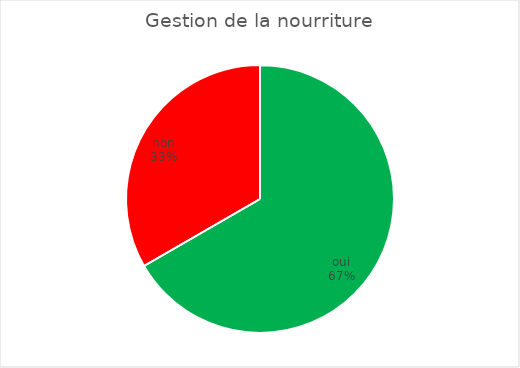
| Category | Gestion de la nourriture |
|---|---|
| oui | 8 |
| non | 4 |